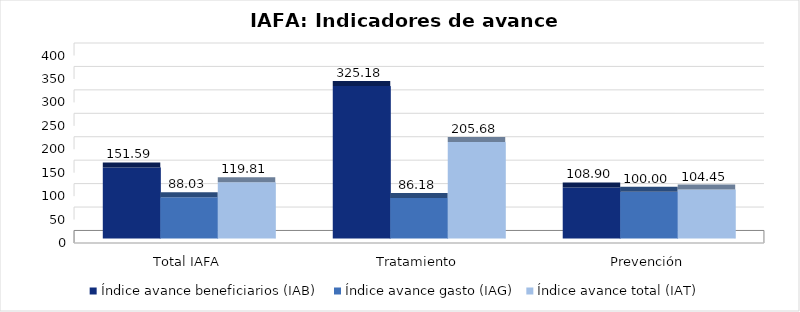
| Category | Índice avance beneficiarios (IAB)  | Índice avance gasto (IAG) | Índice avance total (IAT)  |
|---|---|---|---|
| Total IAFA | 151.585 | 88.03 | 119.808 |
| Tratamiento | 325.18 | 86.182 | 205.681 |
| Prevención | 108.903 | 100 | 104.452 |